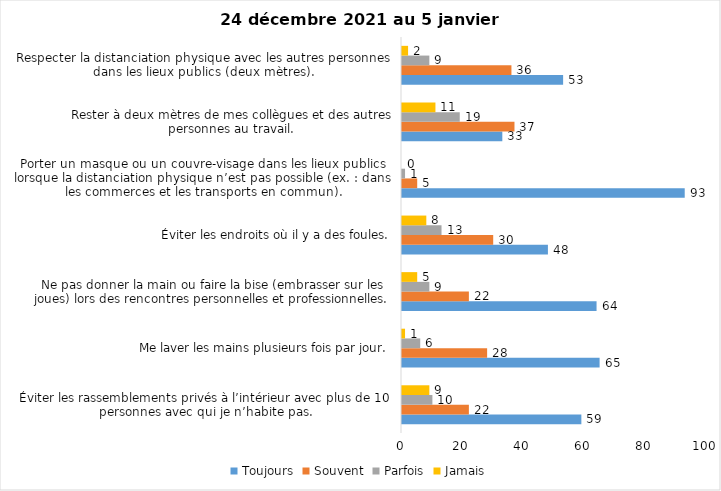
| Category | Toujours | Souvent | Parfois | Jamais |
|---|---|---|---|---|
| Éviter les rassemblements privés à l’intérieur avec plus de 10 personnes avec qui je n’habite pas. | 59 | 22 | 10 | 9 |
| Me laver les mains plusieurs fois par jour. | 65 | 28 | 6 | 1 |
| Ne pas donner la main ou faire la bise (embrasser sur les joues) lors des rencontres personnelles et professionnelles. | 64 | 22 | 9 | 5 |
| Éviter les endroits où il y a des foules. | 48 | 30 | 13 | 8 |
| Porter un masque ou un couvre-visage dans les lieux publics lorsque la distanciation physique n’est pas possible (ex. : dans les commerces et les transports en commun). | 93 | 5 | 1 | 0 |
| Rester à deux mètres de mes collègues et des autres personnes au travail. | 33 | 37 | 19 | 11 |
| Respecter la distanciation physique avec les autres personnes dans les lieux publics (deux mètres). | 53 | 36 | 9 | 2 |